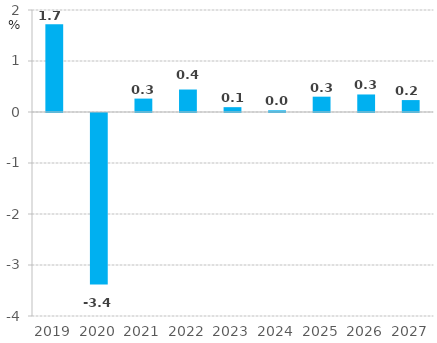
| Category | RRZ |
|---|---|
| 2019.0 | 1.723 |
| 2020.0 | -3.364 |
| 2021.0 | 0.263 |
| 2022.0 | 0.441 |
| 2023.0 | 0.095 |
| 2024.0 | 0.033 |
| 2025.0 | 0.3 |
| 2026.0 | 0.344 |
| 2027.0 | 0.234 |